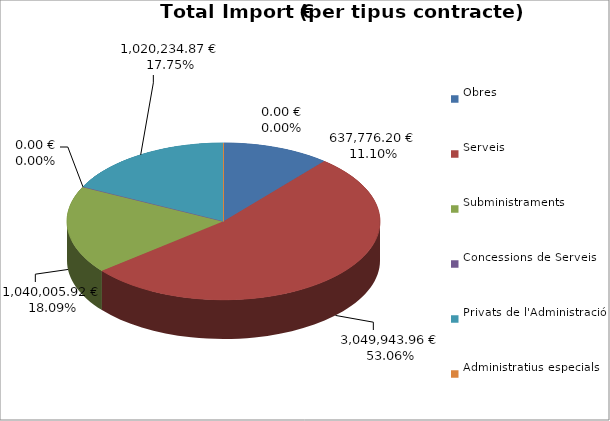
| Category | Total preu
(amb IVA) |
|---|---|
| Obres | 637776.2 |
| Serveis | 3049943.965 |
| Subministraments | 1040005.92 |
| Concessions de Serveis | 0 |
| Privats de l'Administració | 1020234.87 |
| Administratius especials | 0 |